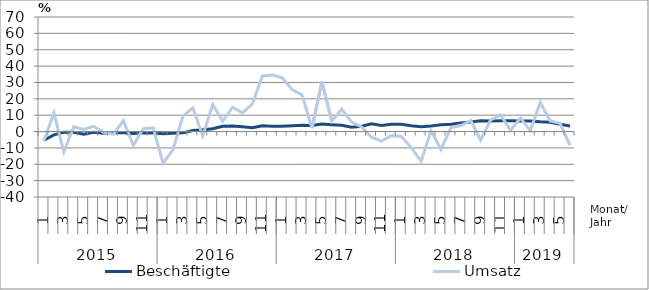
| Category | Beschäftigte | Umsatz |
|---|---|---|
| 0 | -5.3 | -5.5 |
| 1 | -2 | 11.4 |
| 2 | -0.5 | -12.4 |
| 3 | -0.5 | 2.9 |
| 4 | -1.7 | 1.3 |
| 5 | -0.5 | 3.2 |
| 6 | -1.1 | -0.5 |
| 7 | -0.8 | -1.7 |
| 8 | -0.7 | 6.7 |
| 9 | -1.2 | -8.5 |
| 10 | -0.7 | 1.7 |
| 11 | -0.9 | 2.3 |
| 12 | -1.3 | -19.4 |
| 13 | -1.1 | -11 |
| 14 | -0.8 | 9.4 |
| 15 | 0.6 | 14.4 |
| 16 | 1.1 | -2.6 |
| 17 | 1.7 | 16.5 |
| 18 | 3.2 | 6.3 |
| 19 | 3.4 | 14.9 |
| 20 | 3 | 11.4 |
| 21 | 2.4 | 16.9 |
| 22 | 3.6 | 34 |
| 23 | 3.2 | 34.5 |
| 24 | 3.3 | 32.8 |
| 25 | 3.6 | 25.7 |
| 26 | 3.9 | 22.4 |
| 27 | 3.7 | 2.1 |
| 28 | 4.6 | 30.4 |
| 29 | 4.2 | 6.4 |
| 30 | 3.8 | 13.7 |
| 31 | 2.7 | 5.8 |
| 32 | 3.3 | 2.8 |
| 33 | 4.7 | -3.4 |
| 34 | 3.7 | -5.8 |
| 35 | 4.4 | -2.5 |
| 36 | 4.5 | -3 |
| 37 | 3.6 | -9.8 |
| 38 | 2.9 | -18.1 |
| 39 | 3.4 | 0.5 |
| 40 | 4.2 | -11 |
| 41 | 4.5 | 2.5 |
| 42 | 5.3 | 3.7 |
| 43 | 5.8 | 6.8 |
| 44 | 6.6 | -5.2 |
| 45 | 6.5 | 7.1 |
| 46 | 6.6 | 10.1 |
| 47 | 6.6 | 0.8 |
| 48 | 6.4 | 8.2 |
| 49 | 6.5 | 0.6 |
| 50 | 6 | 17.8 |
| 51 | 5.7 | 6.5 |
| 52 | 4.4 | 5 |
| 53 | 3.4 | -8.5 |